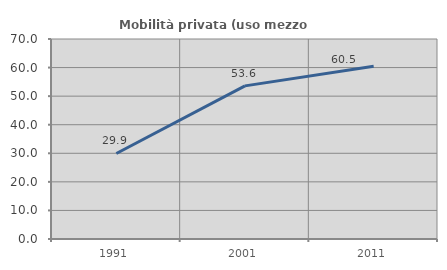
| Category | Mobilità privata (uso mezzo privato) |
|---|---|
| 1991.0 | 29.936 |
| 2001.0 | 53.59 |
| 2011.0 | 60.459 |